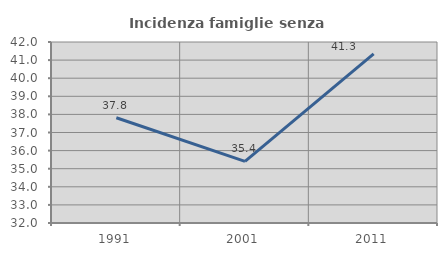
| Category | Incidenza famiglie senza nuclei |
|---|---|
| 1991.0 | 37.816 |
| 2001.0 | 35.401 |
| 2011.0 | 41.349 |